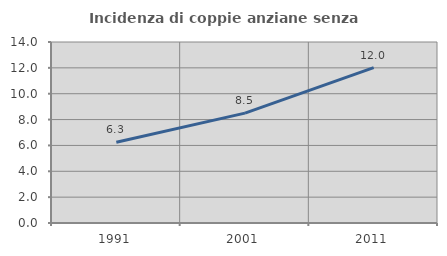
| Category | Incidenza di coppie anziane senza figli  |
|---|---|
| 1991.0 | 6.25 |
| 2001.0 | 8.501 |
| 2011.0 | 12.015 |